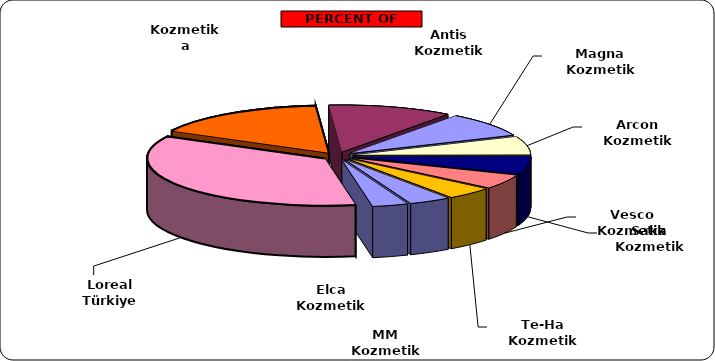
| Category | Series 0 |
|---|---|
| Loreal Türkiye | 11144 |
| Kozmetika | 5043 |
| Antis Kozmetik | 3562 |
| Magna Kozmetik | 2649 |
| Arcon Kozmetik | 1968 |
| Saka Kozmetik | 1918 |
| Vesco Kozmetik | 1530 |
| Te-Ha Kozmetik | 1339 |
| MM Kozmetik | 1199 |
| Elca Kozmetik | 1020 |